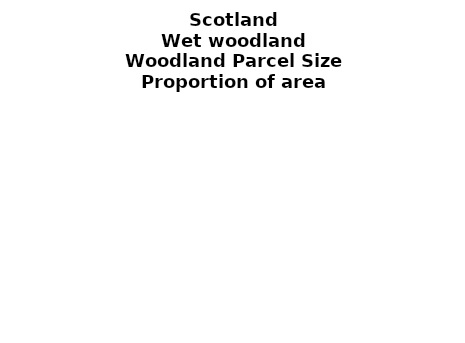
| Category | Wet woodland |
|---|---|
| <5 ha | 0.147 |
| ≥5 and <10 ha | 0.066 |
| ≥10 and <15 ha | 0.046 |
| ≥15 and <20 ha | 0.026 |
| ≥20 and <25 ha | 0.012 |
| ≥25 and <30 ha | 0.021 |
| ≥30 and <35 ha | 0.003 |
| ≥35 and <40 ha | 0.01 |
| ≥40 and <45 ha | 0.016 |
| ≥45 and <50 ha | 0.012 |
| ≥50 and <60 ha | 0.016 |
| ≥60 and <70 ha | 0.016 |
| ≥70 and <80 ha | 0.053 |
| ≥80 and <90 ha | 0.008 |
| ≥90 and <100 ha | 0.009 |
| ≥100 and <150 ha | 0.07 |
| ≥150 and <200 ha | 0.022 |
| ≥200 ha | 0.447 |